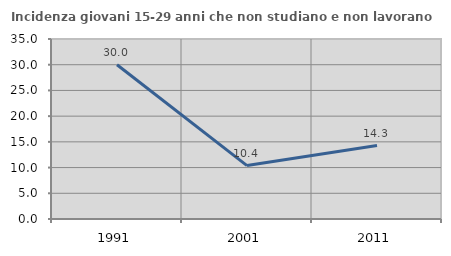
| Category | Incidenza giovani 15-29 anni che non studiano e non lavorano  |
|---|---|
| 1991.0 | 30 |
| 2001.0 | 10.39 |
| 2011.0 | 14.286 |